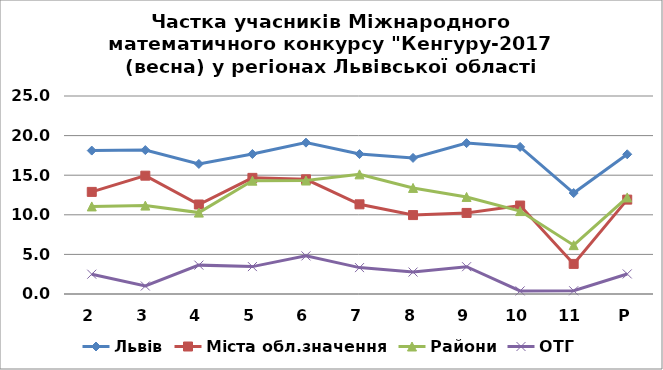
| Category | Львів | Міста обл.значення | Райони | ОТГ |
|---|---|---|---|---|
| 2 | 18.111 | 12.891 | 11.057 | 2.5 |
| 3 | 18.17 | 14.939 | 11.164 | 1.012 |
| 4 | 16.424 | 11.302 | 10.278 | 3.645 |
| 5 | 17.677 | 14.663 | 14.308 | 3.46 |
| 6 | 19.109 | 14.484 | 14.327 | 4.811 |
| 7 | 17.667 | 11.323 | 15.106 | 3.333 |
| 8 | 17.184 | 9.963 | 13.394 | 2.769 |
| 9 | 19.051 | 10.236 | 12.255 | 3.448 |
| 10 | 18.574 | 11.169 | 10.471 | 0.391 |
| 11 | 12.745 | 3.8 | 6.168 | 0.407 |
| Р | 17.642 | 11.917 | 12.194 | 2.532 |